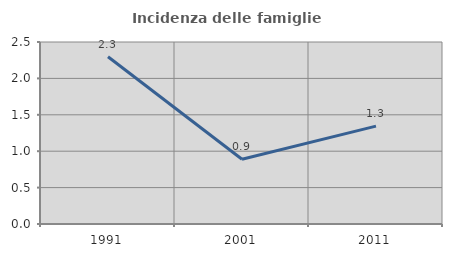
| Category | Incidenza delle famiglie numerose |
|---|---|
| 1991.0 | 2.298 |
| 2001.0 | 0.89 |
| 2011.0 | 1.344 |